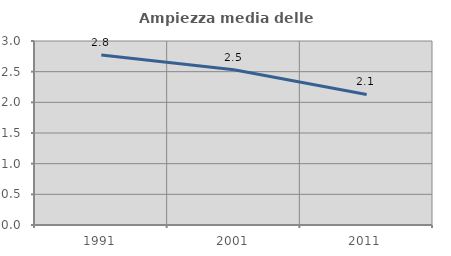
| Category | Ampiezza media delle famiglie |
|---|---|
| 1991.0 | 2.774 |
| 2001.0 | 2.531 |
| 2011.0 | 2.128 |